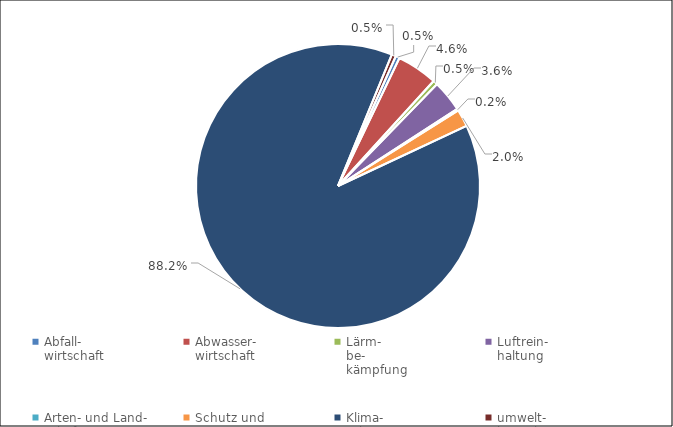
| Category | 2020 |
|---|---|
| Abfall-
wirtschaft | 10108.848 |
| Abwasser-
wirtschaft | 102966.656 |
| Lärm-
be-
kämpfung | 11412.26 |
| Luftrein-
haltung | 79828.415 |
| Arten- und Land-
schafts-
schutz | 4397.339 |
| Schutz und
Sanierung von
Boden, Grund-
u. Ober-
flächen-
wasser | 43633.989 |
| Klima-
schutz | 1957319.164 |
| umwelt-
bereichs-
über-
greifend | 10753.401 |